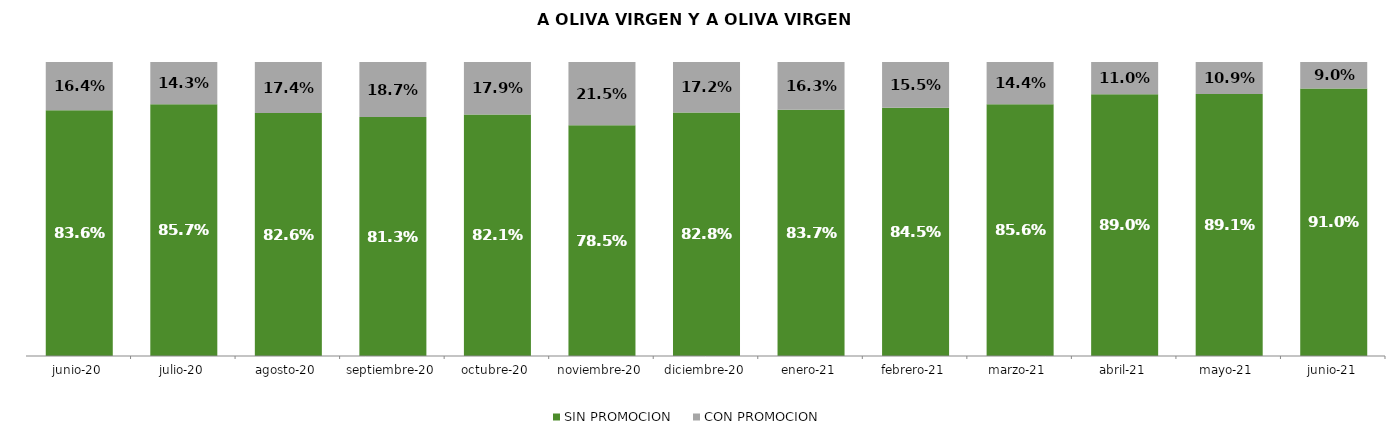
| Category | SIN PROMOCION   | CON PROMOCION   |
|---|---|---|
| 2020-06-01 | 0.836 | 0.164 |
| 2020-07-01 | 0.857 | 0.143 |
| 2020-08-01 | 0.826 | 0.174 |
| 2020-09-01 | 0.813 | 0.187 |
| 2020-10-01 | 0.821 | 0.179 |
| 2020-11-01 | 0.785 | 0.215 |
| 2020-12-01 | 0.828 | 0.172 |
| 2021-01-01 | 0.837 | 0.163 |
| 2021-02-01 | 0.845 | 0.155 |
| 2021-03-01 | 0.856 | 0.144 |
| 2021-04-01 | 0.89 | 0.11 |
| 2021-05-01 | 0.891 | 0.109 |
| 2021-06-01 | 0.91 | 0.09 |